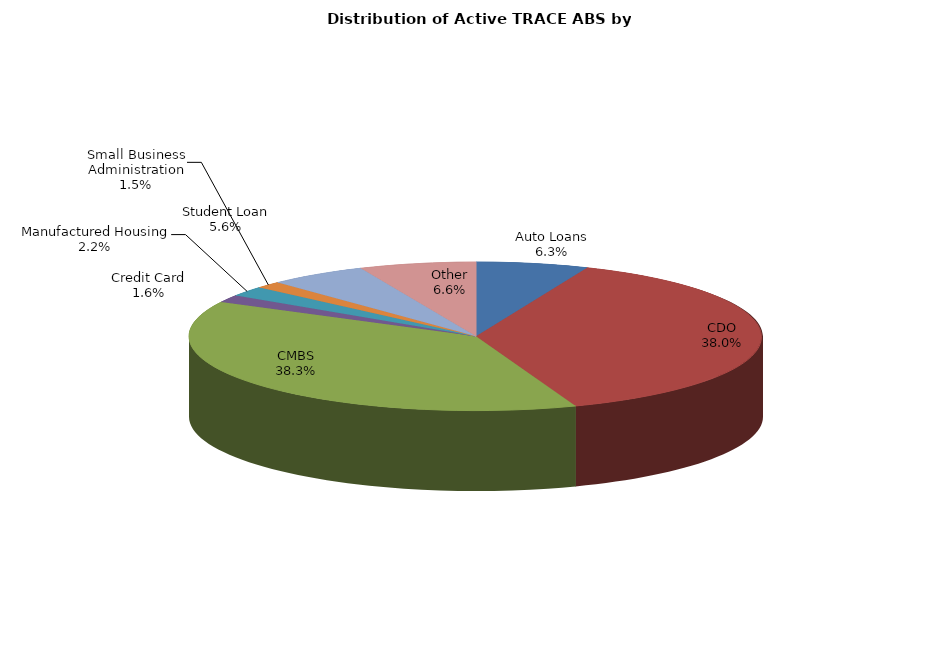
| Category | Series 0 |
|---|---|
| Auto Loans | 1431 |
| CDO | 8600 |
| CMBS | 8656 |
| Credit Card | 360 |
| Manufactured Housing | 491 |
| Small Business Administration | 331 |
| Student Loan | 1258 |
| Other | 1487 |